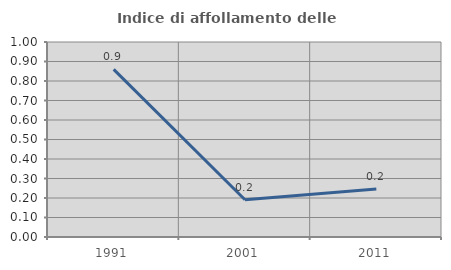
| Category | Indice di affollamento delle abitazioni  |
|---|---|
| 1991.0 | 0.86 |
| 2001.0 | 0.191 |
| 2011.0 | 0.247 |